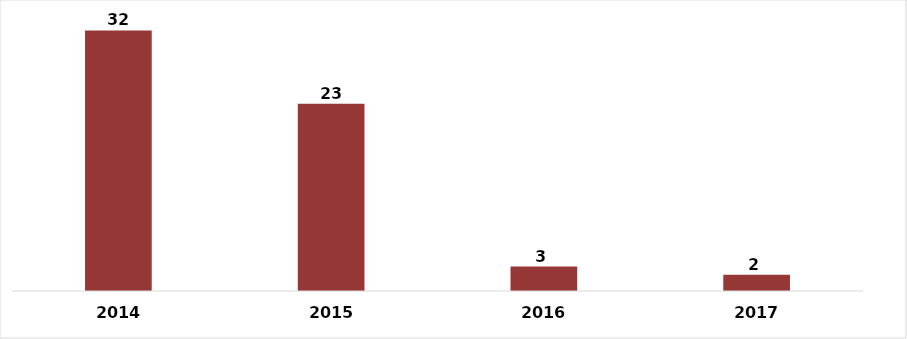
| Category | CANTIDAD |
|---|---|
| 2014.0 | 32 |
| 2015.0 | 23 |
| 2016.0 | 3 |
| 2017.0 | 2 |